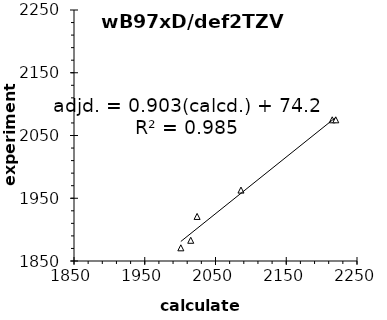
| Category | wB97xD |
|---|---|
| 2001.0 | 1871 |
| 2015.0 | 1883 |
| 2024.0 | 1921 |
| 2086.0 | 1963 |
| 2215.0 | 2075 |
| 2220.0 | 2075 |